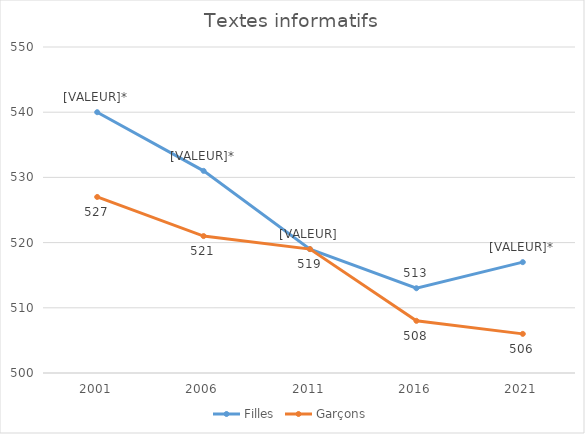
| Category | Filles | Garçons |
|---|---|---|
| 2001.0 | 540 | 527 |
| 2006.0 | 531 | 521 |
| 2011.0 | 519 | 519 |
| 2016.0 | 513 | 508 |
| 2021.0 | 517 | 506 |